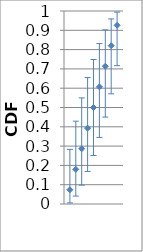
| Category | 0.5 |
|---|---|
| 6.0 | 0.607 |
| 7.0 | 0.714 |
| 5.0 | 0.5 |
| 4.0 | 0.393 |
| 3.0 | 0.286 |
| 9.0 | 0.926 |
| 8.0 | 0.82 |
| 1.0 | 0.074 |
| 2.0 | 0.18 |